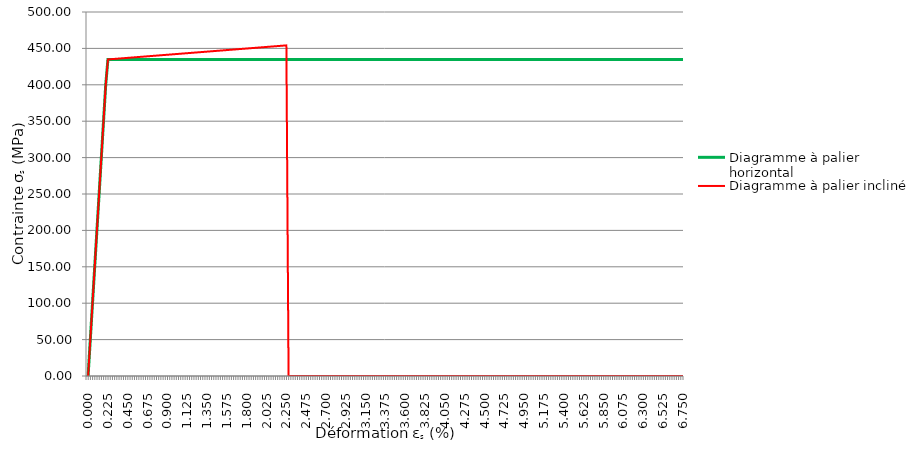
| Category | Diagramme à palier horizontal | Diagramme à palier incliné |
|---|---|---|
| 0.0 | 0 | 0 |
| 0.025 | 50 | 50 |
| 0.05 | 100 | 100 |
| 0.075 | 150 | 150 |
| 0.1 | 200 | 200 |
| 0.125 | 250 | 250 |
| 0.15 | 300 | 300 |
| 0.175 | 350 | 350 |
| 0.2 | 400 | 400 |
| 0.225 | 434.783 | 434.855 |
| 0.25 | 434.783 | 435.093 |
| 0.275 | 434.783 | 435.331 |
| 0.3 | 434.783 | 435.569 |
| 0.325 | 434.783 | 435.807 |
| 0.35 | 434.783 | 436.046 |
| 0.375 | 434.783 | 436.284 |
| 0.4 | 434.783 | 436.522 |
| 0.425 | 434.783 | 436.76 |
| 0.45 | 434.783 | 436.998 |
| 0.475 | 434.783 | 437.236 |
| 0.5 | 434.783 | 437.474 |
| 0.525 | 434.783 | 437.712 |
| 0.55 | 434.783 | 437.95 |
| 0.575 | 434.783 | 438.188 |
| 0.6 | 434.783 | 438.427 |
| 0.625 | 434.783 | 438.665 |
| 0.65 | 434.783 | 438.903 |
| 0.675 | 434.783 | 439.141 |
| 0.7 | 434.783 | 439.379 |
| 0.725 | 434.783 | 439.617 |
| 0.75 | 434.783 | 439.855 |
| 0.775 | 434.783 | 440.093 |
| 0.8 | 434.783 | 440.331 |
| 0.825 | 434.783 | 440.569 |
| 0.85 | 434.783 | 440.807 |
| 0.875 | 434.783 | 441.046 |
| 0.9 | 434.783 | 441.284 |
| 0.925 | 434.783 | 441.522 |
| 0.95 | 434.783 | 441.76 |
| 0.975 | 434.783 | 441.998 |
| 1.0 | 434.783 | 442.236 |
| 1.025 | 434.783 | 442.474 |
| 1.05 | 434.783 | 442.712 |
| 1.075 | 434.783 | 442.95 |
| 1.1 | 434.783 | 443.188 |
| 1.125 | 434.783 | 443.427 |
| 1.15 | 434.783 | 443.665 |
| 1.175 | 434.783 | 443.903 |
| 1.2 | 434.783 | 444.141 |
| 1.225 | 434.783 | 444.379 |
| 1.25 | 434.783 | 444.617 |
| 1.275 | 434.783 | 444.855 |
| 1.3 | 434.783 | 445.093 |
| 1.325 | 434.783 | 445.331 |
| 1.35 | 434.783 | 445.569 |
| 1.375 | 434.783 | 445.807 |
| 1.4 | 434.783 | 446.046 |
| 1.425 | 434.783 | 446.284 |
| 1.45 | 434.783 | 446.522 |
| 1.475 | 434.783 | 446.76 |
| 1.5 | 434.783 | 446.998 |
| 1.525 | 434.783 | 447.236 |
| 1.55 | 434.783 | 447.474 |
| 1.575 | 434.783 | 447.712 |
| 1.6 | 434.783 | 447.95 |
| 1.625 | 434.783 | 448.188 |
| 1.65 | 434.783 | 448.427 |
| 1.675 | 434.783 | 448.665 |
| 1.7 | 434.783 | 448.903 |
| 1.725 | 434.783 | 449.141 |
| 1.75 | 434.783 | 449.379 |
| 1.775 | 434.783 | 449.617 |
| 1.8 | 434.783 | 449.855 |
| 1.825 | 434.783 | 450.093 |
| 1.85 | 434.783 | 450.331 |
| 1.875 | 434.783 | 450.569 |
| 1.9 | 434.783 | 450.807 |
| 1.925 | 434.783 | 451.046 |
| 1.95 | 434.783 | 451.284 |
| 1.975 | 434.783 | 451.522 |
| 2.0 | 434.783 | 451.76 |
| 2.025 | 434.783 | 451.998 |
| 2.05 | 434.783 | 452.236 |
| 2.075 | 434.783 | 452.474 |
| 2.1 | 434.783 | 452.712 |
| 2.125 | 434.783 | 452.95 |
| 2.15 | 434.783 | 453.188 |
| 2.175 | 434.783 | 453.427 |
| 2.2 | 434.783 | 453.665 |
| 2.225 | 434.783 | 453.903 |
| 2.25 | 434.783 | 454.141 |
| 2.275 | 434.783 | 0 |
| 2.3 | 434.783 | 0 |
| 2.325 | 434.783 | 0 |
| 2.35 | 434.783 | 0 |
| 2.375 | 434.783 | 0 |
| 2.4 | 434.783 | 0 |
| 2.425 | 434.783 | 0 |
| 2.45 | 434.783 | 0 |
| 2.475 | 434.783 | 0 |
| 2.5 | 434.783 | 0 |
| 2.525 | 434.783 | 0 |
| 2.55 | 434.783 | 0 |
| 2.575 | 434.783 | 0 |
| 2.6 | 434.783 | 0 |
| 2.625 | 434.783 | 0 |
| 2.65 | 434.783 | 0 |
| 2.675 | 434.783 | 0 |
| 2.7 | 434.783 | 0 |
| 2.725 | 434.783 | 0 |
| 2.75 | 434.783 | 0 |
| 2.775 | 434.783 | 0 |
| 2.8 | 434.783 | 0 |
| 2.825 | 434.783 | 0 |
| 2.85 | 434.783 | 0 |
| 2.875 | 434.783 | 0 |
| 2.9 | 434.783 | 0 |
| 2.925 | 434.783 | 0 |
| 2.95 | 434.783 | 0 |
| 2.975 | 434.783 | 0 |
| 3.0 | 434.783 | 0 |
| 3.025 | 434.783 | 0 |
| 3.05 | 434.783 | 0 |
| 3.075 | 434.783 | 0 |
| 3.1 | 434.783 | 0 |
| 3.125 | 434.783 | 0 |
| 3.15 | 434.783 | 0 |
| 3.175 | 434.783 | 0 |
| 3.2 | 434.783 | 0 |
| 3.225 | 434.783 | 0 |
| 3.25 | 434.783 | 0 |
| 3.275 | 434.783 | 0 |
| 3.3 | 434.783 | 0 |
| 3.325 | 434.783 | 0 |
| 3.35 | 434.783 | 0 |
| 3.375 | 434.783 | 0 |
| 3.4 | 434.783 | 0 |
| 3.425 | 434.783 | 0 |
| 3.45 | 434.783 | 0 |
| 3.475 | 434.783 | 0 |
| 3.5 | 434.783 | 0 |
| 3.525 | 434.783 | 0 |
| 3.55 | 434.783 | 0 |
| 3.575 | 434.783 | 0 |
| 3.6 | 434.783 | 0 |
| 3.625 | 434.783 | 0 |
| 3.65 | 434.783 | 0 |
| 3.675 | 434.783 | 0 |
| 3.7 | 434.783 | 0 |
| 3.725 | 434.783 | 0 |
| 3.75 | 434.783 | 0 |
| 3.775 | 434.783 | 0 |
| 3.8 | 434.783 | 0 |
| 3.825 | 434.783 | 0 |
| 3.85 | 434.783 | 0 |
| 3.875 | 434.783 | 0 |
| 3.9 | 434.783 | 0 |
| 3.925 | 434.783 | 0 |
| 3.95 | 434.783 | 0 |
| 3.975 | 434.783 | 0 |
| 4.0 | 434.783 | 0 |
| 4.025 | 434.783 | 0 |
| 4.05 | 434.783 | 0 |
| 4.075 | 434.783 | 0 |
| 4.1 | 434.783 | 0 |
| 4.125 | 434.783 | 0 |
| 4.15 | 434.783 | 0 |
| 4.175 | 434.783 | 0 |
| 4.2 | 434.783 | 0 |
| 4.225 | 434.783 | 0 |
| 4.25 | 434.783 | 0 |
| 4.275 | 434.783 | 0 |
| 4.3 | 434.783 | 0 |
| 4.325 | 434.783 | 0 |
| 4.35 | 434.783 | 0 |
| 4.375 | 434.783 | 0 |
| 4.4 | 434.783 | 0 |
| 4.425 | 434.783 | 0 |
| 4.45 | 434.783 | 0 |
| 4.475 | 434.783 | 0 |
| 4.5 | 434.783 | 0 |
| 4.525 | 434.783 | 0 |
| 4.55 | 434.783 | 0 |
| 4.575 | 434.783 | 0 |
| 4.6 | 434.783 | 0 |
| 4.625 | 434.783 | 0 |
| 4.65 | 434.783 | 0 |
| 4.675 | 434.783 | 0 |
| 4.7 | 434.783 | 0 |
| 4.725 | 434.783 | 0 |
| 4.75 | 434.783 | 0 |
| 4.775 | 434.783 | 0 |
| 4.8 | 434.783 | 0 |
| 4.825 | 434.783 | 0 |
| 4.85 | 434.783 | 0 |
| 4.875 | 434.783 | 0 |
| 4.9 | 434.783 | 0 |
| 4.925 | 434.783 | 0 |
| 4.95 | 434.783 | 0 |
| 4.975 | 434.783 | 0 |
| 5.0 | 434.783 | 0 |
| 5.025 | 434.783 | 0 |
| 5.05 | 434.783 | 0 |
| 5.075 | 434.783 | 0 |
| 5.1 | 434.783 | 0 |
| 5.125 | 434.783 | 0 |
| 5.15 | 434.783 | 0 |
| 5.175 | 434.783 | 0 |
| 5.2 | 434.783 | 0 |
| 5.225 | 434.783 | 0 |
| 5.25 | 434.783 | 0 |
| 5.275 | 434.783 | 0 |
| 5.3 | 434.783 | 0 |
| 5.325 | 434.783 | 0 |
| 5.35 | 434.783 | 0 |
| 5.375 | 434.783 | 0 |
| 5.4 | 434.783 | 0 |
| 5.425 | 434.783 | 0 |
| 5.45 | 434.783 | 0 |
| 5.475 | 434.783 | 0 |
| 5.5 | 434.783 | 0 |
| 5.525 | 434.783 | 0 |
| 5.55 | 434.783 | 0 |
| 5.575 | 434.783 | 0 |
| 5.6 | 434.783 | 0 |
| 5.625 | 434.783 | 0 |
| 5.65 | 434.783 | 0 |
| 5.675 | 434.783 | 0 |
| 5.7 | 434.783 | 0 |
| 5.725 | 434.783 | 0 |
| 5.75 | 434.783 | 0 |
| 5.775 | 434.783 | 0 |
| 5.8 | 434.783 | 0 |
| 5.825 | 434.783 | 0 |
| 5.85 | 434.783 | 0 |
| 5.875 | 434.783 | 0 |
| 5.9 | 434.783 | 0 |
| 5.925 | 434.783 | 0 |
| 5.95 | 434.783 | 0 |
| 5.975 | 434.783 | 0 |
| 6.0 | 434.783 | 0 |
| 6.025 | 434.783 | 0 |
| 6.05 | 434.783 | 0 |
| 6.075 | 434.783 | 0 |
| 6.1 | 434.783 | 0 |
| 6.125 | 434.783 | 0 |
| 6.15 | 434.783 | 0 |
| 6.175 | 434.783 | 0 |
| 6.2 | 434.783 | 0 |
| 6.225 | 434.783 | 0 |
| 6.25 | 434.783 | 0 |
| 6.275 | 434.783 | 0 |
| 6.3 | 434.783 | 0 |
| 6.325 | 434.783 | 0 |
| 6.35 | 434.783 | 0 |
| 6.375 | 434.783 | 0 |
| 6.4 | 434.783 | 0 |
| 6.425 | 434.783 | 0 |
| 6.45 | 434.783 | 0 |
| 6.475 | 434.783 | 0 |
| 6.5 | 434.783 | 0 |
| 6.525 | 434.783 | 0 |
| 6.55 | 434.783 | 0 |
| 6.575 | 434.783 | 0 |
| 6.6 | 434.783 | 0 |
| 6.625 | 434.783 | 0 |
| 6.65 | 434.783 | 0 |
| 6.675 | 434.783 | 0 |
| 6.7 | 434.783 | 0 |
| 6.725 | 434.783 | 0 |
| 6.75 | 434.783 | 0 |